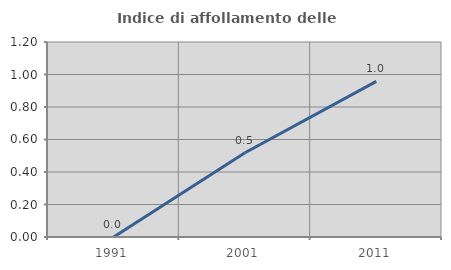
| Category | Indice di affollamento delle abitazioni  |
|---|---|
| 1991.0 | 0 |
| 2001.0 | 0.518 |
| 2011.0 | 0.958 |